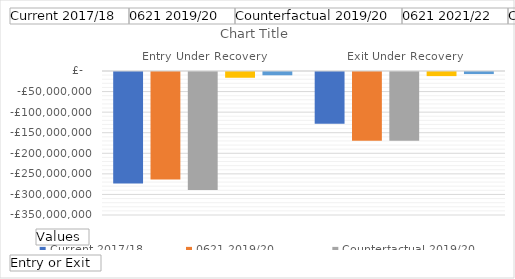
| Category | Current 2017/18 | 0621 2019/20  | Counterfactual 2019/20 | 0621 2021/22  | Counterfactual 2021/22 |
|---|---|---|---|---|---|
| Entry Under Recovery | -271000000 | -261000000 | -287000000 | -14000000 | -8000000 |
| Exit Under Recovery | -126000000 | -167000000 | -167000000 | -10000000 | -5000000 |